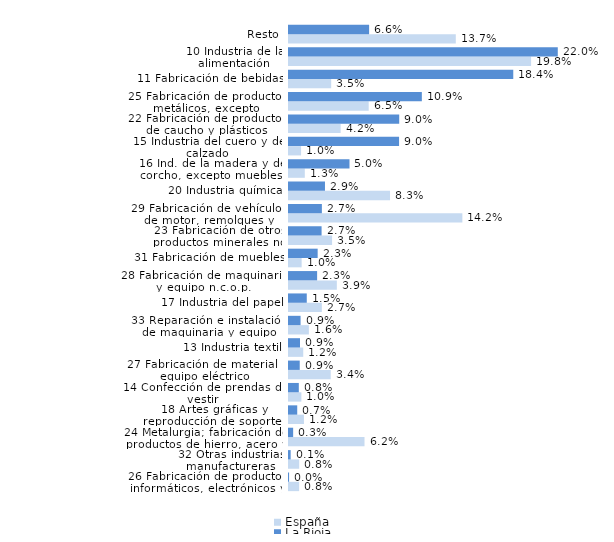
| Category | España | La Rioja |
|---|---|---|
| 26 Fabricación de productos informáticos, electrónicos y ópticos | 0.008 | 0 |
| 32 Otras industrias manufactureras | 0.008 | 0.001 |
| 24 Metalurgia; fabricación de productos de hierro, acero y ferroaleaciones | 0.062 | 0.003 |
| 18 Artes gráficas y reproducción de soportes grabados | 0.012 | 0.007 |
| 14 Confección de prendas de vestir | 0.01 | 0.008 |
| 27 Fabricación de material y equipo eléctrico | 0.034 | 0.009 |
| 13 Industria textil | 0.012 | 0.009 |
| 33 Reparación e instalación de maquinaria y equipo | 0.016 | 0.009 |
| 17 Industria del papel | 0.027 | 0.015 |
| 28 Fabricación de maquinaria y equipo n.c.o.p. | 0.039 | 0.023 |
| 31 Fabricación de muebles | 0.01 | 0.023 |
| 23 Fabricación de otros productos minerales no metálicos | 0.035 | 0.027 |
| 29 Fabricación de vehículos de motor, remolques y semirremolques | 0.142 | 0.027 |
| 20 Industria química | 0.083 | 0.029 |
| 16 Ind. de la madera y del corcho, excepto muebles; cestería y espartería | 0.013 | 0.05 |
| 15 Industria del cuero y del calzado | 0.01 | 0.09 |
| 22 Fabricación de productos de caucho y plásticos | 0.042 | 0.09 |
| 25 Fabricación de productos metálicos, excepto maquinaria y equipo | 0.065 | 0.109 |
| 11 Fabricación de bebidas | 0.035 | 0.184 |
| 10 Industria de la alimentación | 0.198 | 0.22 |
| Resto | 0.137 | 0.066 |